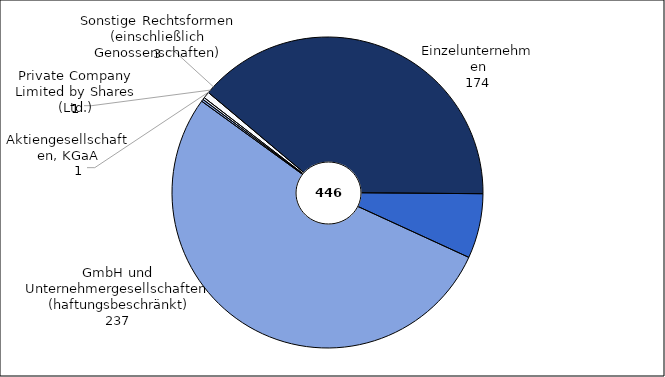
| Category | Series 0 |
|---|---|
| Einzelunternehmen | 174 |
| Personengesellschaften (OHG, KG, GbR) | 30 |
| Gesellschaften m.b.H. (einschließlich Unternehmergesellschaften (haftungsbeschränkt)) | 237 |
| Aktiengesellschaften, KGaA | 1 |
| Private Company Limited by Shares (Ltd.) | 1 |
| Sonstige Rechtsformen (einschließlich Genossenschaften) | 3 |